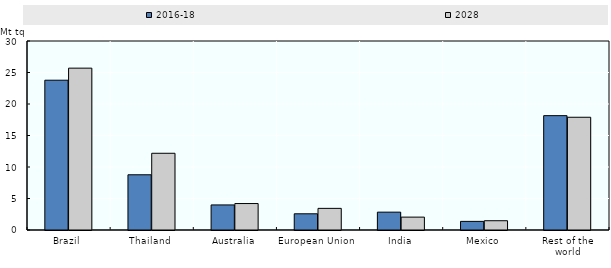
| Category | 2016-18 | 2028 |
|---|---|---|
| Brazil | 23.775 | 25.69 |
| Thailand | 8.766 | 12.178 |
| Australia | 3.978 | 4.201 |
| European Union | 2.574 | 3.435 |
| India | 2.834 | 2.046 |
| Mexico | 1.367 | 1.472 |
| Rest of the world | 18.151 | 17.896 |